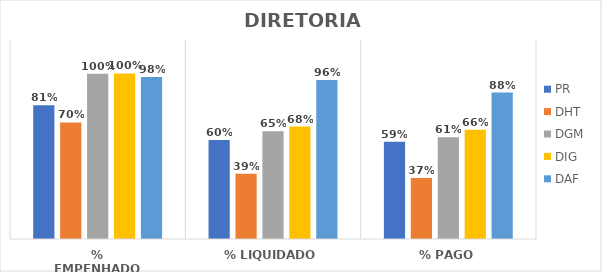
| Category | PR | DHT | DGM | DIG | DAF |
|---|---|---|---|---|---|
| % EMPENHADO | 0.807 | 0.703 | 0.997 | 0.998 | 0.977 |
| % LIQUIDADO | 0.597 | 0.393 | 0.65 | 0.678 | 0.959 |
| % PAGO | 0.586 | 0.367 | 0.614 | 0.659 | 0.883 |